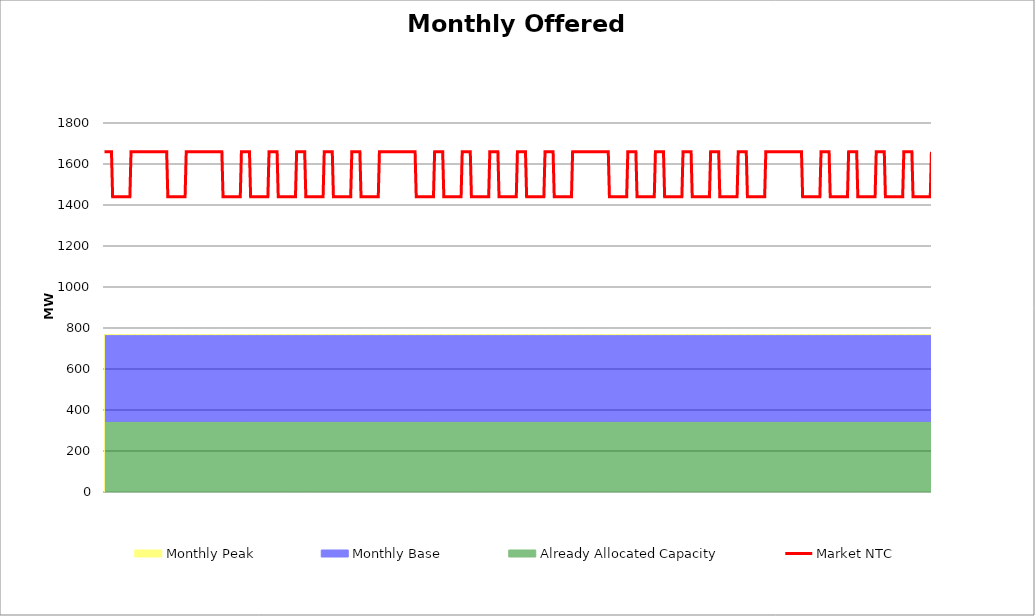
| Category | Market NTC |
|---|---|
| 0 | 1660 |
| 1 | 1660 |
| 2 | 1660 |
| 3 | 1660 |
| 4 | 1660 |
| 5 | 1660 |
| 6 | 1660 |
| 7 | 1440 |
| 8 | 1440 |
| 9 | 1440 |
| 10 | 1440 |
| 11 | 1440 |
| 12 | 1440 |
| 13 | 1440 |
| 14 | 1440 |
| 15 | 1440 |
| 16 | 1440 |
| 17 | 1440 |
| 18 | 1440 |
| 19 | 1440 |
| 20 | 1440 |
| 21 | 1440 |
| 22 | 1440 |
| 23 | 1660 |
| 24 | 1660 |
| 25 | 1660 |
| 26 | 1660 |
| 27 | 1660 |
| 28 | 1660 |
| 29 | 1660 |
| 30 | 1660 |
| 31 | 1660 |
| 32 | 1660 |
| 33 | 1660 |
| 34 | 1660 |
| 35 | 1660 |
| 36 | 1660 |
| 37 | 1660 |
| 38 | 1660 |
| 39 | 1660 |
| 40 | 1660 |
| 41 | 1660 |
| 42 | 1660 |
| 43 | 1660 |
| 44 | 1660 |
| 45 | 1660 |
| 46 | 1660 |
| 47 | 1660 |
| 48 | 1660 |
| 49 | 1660 |
| 50 | 1660 |
| 51 | 1660 |
| 52 | 1660 |
| 53 | 1660 |
| 54 | 1660 |
| 55 | 1440 |
| 56 | 1440 |
| 57 | 1440 |
| 58 | 1440 |
| 59 | 1440 |
| 60 | 1440 |
| 61 | 1440 |
| 62 | 1440 |
| 63 | 1440 |
| 64 | 1440 |
| 65 | 1440 |
| 66 | 1440 |
| 67 | 1440 |
| 68 | 1440 |
| 69 | 1440 |
| 70 | 1440 |
| 71 | 1660 |
| 72 | 1660 |
| 73 | 1660 |
| 74 | 1660 |
| 75 | 1660 |
| 76 | 1660 |
| 77 | 1660 |
| 78 | 1660 |
| 79 | 1660 |
| 80 | 1660 |
| 81 | 1660 |
| 82 | 1660 |
| 83 | 1660 |
| 84 | 1660 |
| 85 | 1660 |
| 86 | 1660 |
| 87 | 1660 |
| 88 | 1660 |
| 89 | 1660 |
| 90 | 1660 |
| 91 | 1660 |
| 92 | 1660 |
| 93 | 1660 |
| 94 | 1660 |
| 95 | 1660 |
| 96 | 1660 |
| 97 | 1660 |
| 98 | 1660 |
| 99 | 1660 |
| 100 | 1660 |
| 101 | 1660 |
| 102 | 1660 |
| 103 | 1440 |
| 104 | 1440 |
| 105 | 1440 |
| 106 | 1440 |
| 107 | 1440 |
| 108 | 1440 |
| 109 | 1440 |
| 110 | 1440 |
| 111 | 1440 |
| 112 | 1440 |
| 113 | 1440 |
| 114 | 1440 |
| 115 | 1440 |
| 116 | 1440 |
| 117 | 1440 |
| 118 | 1440 |
| 119 | 1660 |
| 120 | 1660 |
| 121 | 1660 |
| 122 | 1660 |
| 123 | 1660 |
| 124 | 1660 |
| 125 | 1660 |
| 126 | 1660 |
| 127 | 1440 |
| 128 | 1440 |
| 129 | 1440 |
| 130 | 1440 |
| 131 | 1440 |
| 132 | 1440 |
| 133 | 1440 |
| 134 | 1440 |
| 135 | 1440 |
| 136 | 1440 |
| 137 | 1440 |
| 138 | 1440 |
| 139 | 1440 |
| 140 | 1440 |
| 141 | 1440 |
| 142 | 1440 |
| 143 | 1660 |
| 144 | 1660 |
| 145 | 1660 |
| 146 | 1660 |
| 147 | 1660 |
| 148 | 1660 |
| 149 | 1660 |
| 150 | 1660 |
| 151 | 1440 |
| 152 | 1440 |
| 153 | 1440 |
| 154 | 1440 |
| 155 | 1440 |
| 156 | 1440 |
| 157 | 1440 |
| 158 | 1440 |
| 159 | 1440 |
| 160 | 1440 |
| 161 | 1440 |
| 162 | 1440 |
| 163 | 1440 |
| 164 | 1440 |
| 165 | 1440 |
| 166 | 1440 |
| 167 | 1660 |
| 168 | 1660 |
| 169 | 1660 |
| 170 | 1660 |
| 171 | 1660 |
| 172 | 1660 |
| 173 | 1660 |
| 174 | 1660 |
| 175 | 1440 |
| 176 | 1440 |
| 177 | 1440 |
| 178 | 1440 |
| 179 | 1440 |
| 180 | 1440 |
| 181 | 1440 |
| 182 | 1440 |
| 183 | 1440 |
| 184 | 1440 |
| 185 | 1440 |
| 186 | 1440 |
| 187 | 1440 |
| 188 | 1440 |
| 189 | 1440 |
| 190 | 1440 |
| 191 | 1660 |
| 192 | 1660 |
| 193 | 1660 |
| 194 | 1660 |
| 195 | 1660 |
| 196 | 1660 |
| 197 | 1660 |
| 198 | 1660 |
| 199 | 1440 |
| 200 | 1440 |
| 201 | 1440 |
| 202 | 1440 |
| 203 | 1440 |
| 204 | 1440 |
| 205 | 1440 |
| 206 | 1440 |
| 207 | 1440 |
| 208 | 1440 |
| 209 | 1440 |
| 210 | 1440 |
| 211 | 1440 |
| 212 | 1440 |
| 213 | 1440 |
| 214 | 1440 |
| 215 | 1660 |
| 216 | 1660 |
| 217 | 1660 |
| 218 | 1660 |
| 219 | 1660 |
| 220 | 1660 |
| 221 | 1660 |
| 222 | 1660 |
| 223 | 1440 |
| 224 | 1440 |
| 225 | 1440 |
| 226 | 1440 |
| 227 | 1440 |
| 228 | 1440 |
| 229 | 1440 |
| 230 | 1440 |
| 231 | 1440 |
| 232 | 1440 |
| 233 | 1440 |
| 234 | 1440 |
| 235 | 1440 |
| 236 | 1440 |
| 237 | 1440 |
| 238 | 1440 |
| 239 | 1660 |
| 240 | 1660 |
| 241 | 1660 |
| 242 | 1660 |
| 243 | 1660 |
| 244 | 1660 |
| 245 | 1660 |
| 246 | 1660 |
| 247 | 1660 |
| 248 | 1660 |
| 249 | 1660 |
| 250 | 1660 |
| 251 | 1660 |
| 252 | 1660 |
| 253 | 1660 |
| 254 | 1660 |
| 255 | 1660 |
| 256 | 1660 |
| 257 | 1660 |
| 258 | 1660 |
| 259 | 1660 |
| 260 | 1660 |
| 261 | 1660 |
| 262 | 1660 |
| 263 | 1660 |
| 264 | 1660 |
| 265 | 1660 |
| 266 | 1660 |
| 267 | 1660 |
| 268 | 1660 |
| 269 | 1660 |
| 270 | 1660 |
| 271 | 1440 |
| 272 | 1440 |
| 273 | 1440 |
| 274 | 1440 |
| 275 | 1440 |
| 276 | 1440 |
| 277 | 1440 |
| 278 | 1440 |
| 279 | 1440 |
| 280 | 1440 |
| 281 | 1440 |
| 282 | 1440 |
| 283 | 1440 |
| 284 | 1440 |
| 285 | 1440 |
| 286 | 1440 |
| 287 | 1660 |
| 288 | 1660 |
| 289 | 1660 |
| 290 | 1660 |
| 291 | 1660 |
| 292 | 1660 |
| 293 | 1660 |
| 294 | 1660 |
| 295 | 1440 |
| 296 | 1440 |
| 297 | 1440 |
| 298 | 1440 |
| 299 | 1440 |
| 300 | 1440 |
| 301 | 1440 |
| 302 | 1440 |
| 303 | 1440 |
| 304 | 1440 |
| 305 | 1440 |
| 306 | 1440 |
| 307 | 1440 |
| 308 | 1440 |
| 309 | 1440 |
| 310 | 1440 |
| 311 | 1660 |
| 312 | 1660 |
| 313 | 1660 |
| 314 | 1660 |
| 315 | 1660 |
| 316 | 1660 |
| 317 | 1660 |
| 318 | 1660 |
| 319 | 1440 |
| 320 | 1440 |
| 321 | 1440 |
| 322 | 1440 |
| 323 | 1440 |
| 324 | 1440 |
| 325 | 1440 |
| 326 | 1440 |
| 327 | 1440 |
| 328 | 1440 |
| 329 | 1440 |
| 330 | 1440 |
| 331 | 1440 |
| 332 | 1440 |
| 333 | 1440 |
| 334 | 1440 |
| 335 | 1660 |
| 336 | 1660 |
| 337 | 1660 |
| 338 | 1660 |
| 339 | 1660 |
| 340 | 1660 |
| 341 | 1660 |
| 342 | 1660 |
| 343 | 1440 |
| 344 | 1440 |
| 345 | 1440 |
| 346 | 1440 |
| 347 | 1440 |
| 348 | 1440 |
| 349 | 1440 |
| 350 | 1440 |
| 351 | 1440 |
| 352 | 1440 |
| 353 | 1440 |
| 354 | 1440 |
| 355 | 1440 |
| 356 | 1440 |
| 357 | 1440 |
| 358 | 1440 |
| 359 | 1660 |
| 360 | 1660 |
| 361 | 1660 |
| 362 | 1660 |
| 363 | 1660 |
| 364 | 1660 |
| 365 | 1660 |
| 366 | 1660 |
| 367 | 1440 |
| 368 | 1440 |
| 369 | 1440 |
| 370 | 1440 |
| 371 | 1440 |
| 372 | 1440 |
| 373 | 1440 |
| 374 | 1440 |
| 375 | 1440 |
| 376 | 1440 |
| 377 | 1440 |
| 378 | 1440 |
| 379 | 1440 |
| 380 | 1440 |
| 381 | 1440 |
| 382 | 1440 |
| 383 | 1660 |
| 384 | 1660 |
| 385 | 1660 |
| 386 | 1660 |
| 387 | 1660 |
| 388 | 1660 |
| 389 | 1660 |
| 390 | 1660 |
| 391 | 1440 |
| 392 | 1440 |
| 393 | 1440 |
| 394 | 1440 |
| 395 | 1440 |
| 396 | 1440 |
| 397 | 1440 |
| 398 | 1440 |
| 399 | 1440 |
| 400 | 1440 |
| 401 | 1440 |
| 402 | 1440 |
| 403 | 1440 |
| 404 | 1440 |
| 405 | 1440 |
| 406 | 1440 |
| 407 | 1660 |
| 408 | 1660 |
| 409 | 1660 |
| 410 | 1660 |
| 411 | 1660 |
| 412 | 1660 |
| 413 | 1660 |
| 414 | 1660 |
| 415 | 1660 |
| 416 | 1660 |
| 417 | 1660 |
| 418 | 1660 |
| 419 | 1660 |
| 420 | 1660 |
| 421 | 1660 |
| 422 | 1660 |
| 423 | 1660 |
| 424 | 1660 |
| 425 | 1660 |
| 426 | 1660 |
| 427 | 1660 |
| 428 | 1660 |
| 429 | 1660 |
| 430 | 1660 |
| 431 | 1660 |
| 432 | 1660 |
| 433 | 1660 |
| 434 | 1660 |
| 435 | 1660 |
| 436 | 1660 |
| 437 | 1660 |
| 438 | 1660 |
| 439 | 1440 |
| 440 | 1440 |
| 441 | 1440 |
| 442 | 1440 |
| 443 | 1440 |
| 444 | 1440 |
| 445 | 1440 |
| 446 | 1440 |
| 447 | 1440 |
| 448 | 1440 |
| 449 | 1440 |
| 450 | 1440 |
| 451 | 1440 |
| 452 | 1440 |
| 453 | 1440 |
| 454 | 1440 |
| 455 | 1660 |
| 456 | 1660 |
| 457 | 1660 |
| 458 | 1660 |
| 459 | 1660 |
| 460 | 1660 |
| 461 | 1660 |
| 462 | 1660 |
| 463 | 1440 |
| 464 | 1440 |
| 465 | 1440 |
| 466 | 1440 |
| 467 | 1440 |
| 468 | 1440 |
| 469 | 1440 |
| 470 | 1440 |
| 471 | 1440 |
| 472 | 1440 |
| 473 | 1440 |
| 474 | 1440 |
| 475 | 1440 |
| 476 | 1440 |
| 477 | 1440 |
| 478 | 1440 |
| 479 | 1660 |
| 480 | 1660 |
| 481 | 1660 |
| 482 | 1660 |
| 483 | 1660 |
| 484 | 1660 |
| 485 | 1660 |
| 486 | 1660 |
| 487 | 1440 |
| 488 | 1440 |
| 489 | 1440 |
| 490 | 1440 |
| 491 | 1440 |
| 492 | 1440 |
| 493 | 1440 |
| 494 | 1440 |
| 495 | 1440 |
| 496 | 1440 |
| 497 | 1440 |
| 498 | 1440 |
| 499 | 1440 |
| 500 | 1440 |
| 501 | 1440 |
| 502 | 1440 |
| 503 | 1660 |
| 504 | 1660 |
| 505 | 1660 |
| 506 | 1660 |
| 507 | 1660 |
| 508 | 1660 |
| 509 | 1660 |
| 510 | 1660 |
| 511 | 1440 |
| 512 | 1440 |
| 513 | 1440 |
| 514 | 1440 |
| 515 | 1440 |
| 516 | 1440 |
| 517 | 1440 |
| 518 | 1440 |
| 519 | 1440 |
| 520 | 1440 |
| 521 | 1440 |
| 522 | 1440 |
| 523 | 1440 |
| 524 | 1440 |
| 525 | 1440 |
| 526 | 1440 |
| 527 | 1660 |
| 528 | 1660 |
| 529 | 1660 |
| 530 | 1660 |
| 531 | 1660 |
| 532 | 1660 |
| 533 | 1660 |
| 534 | 1660 |
| 535 | 1440 |
| 536 | 1440 |
| 537 | 1440 |
| 538 | 1440 |
| 539 | 1440 |
| 540 | 1440 |
| 541 | 1440 |
| 542 | 1440 |
| 543 | 1440 |
| 544 | 1440 |
| 545 | 1440 |
| 546 | 1440 |
| 547 | 1440 |
| 548 | 1440 |
| 549 | 1440 |
| 550 | 1440 |
| 551 | 1660 |
| 552 | 1660 |
| 553 | 1660 |
| 554 | 1660 |
| 555 | 1660 |
| 556 | 1660 |
| 557 | 1660 |
| 558 | 1660 |
| 559 | 1440 |
| 560 | 1440 |
| 561 | 1440 |
| 562 | 1440 |
| 563 | 1440 |
| 564 | 1440 |
| 565 | 1440 |
| 566 | 1440 |
| 567 | 1440 |
| 568 | 1440 |
| 569 | 1440 |
| 570 | 1440 |
| 571 | 1440 |
| 572 | 1440 |
| 573 | 1440 |
| 574 | 1440 |
| 575 | 1660 |
| 576 | 1660 |
| 577 | 1660 |
| 578 | 1660 |
| 579 | 1660 |
| 580 | 1660 |
| 581 | 1660 |
| 582 | 1660 |
| 583 | 1660 |
| 584 | 1660 |
| 585 | 1660 |
| 586 | 1660 |
| 587 | 1660 |
| 588 | 1660 |
| 589 | 1660 |
| 590 | 1660 |
| 591 | 1660 |
| 592 | 1660 |
| 593 | 1660 |
| 594 | 1660 |
| 595 | 1660 |
| 596 | 1660 |
| 597 | 1660 |
| 598 | 1660 |
| 599 | 1660 |
| 600 | 1660 |
| 601 | 1660 |
| 602 | 1660 |
| 603 | 1660 |
| 604 | 1660 |
| 605 | 1660 |
| 606 | 1660 |
| 607 | 1440 |
| 608 | 1440 |
| 609 | 1440 |
| 610 | 1440 |
| 611 | 1440 |
| 612 | 1440 |
| 613 | 1440 |
| 614 | 1440 |
| 615 | 1440 |
| 616 | 1440 |
| 617 | 1440 |
| 618 | 1440 |
| 619 | 1440 |
| 620 | 1440 |
| 621 | 1440 |
| 622 | 1440 |
| 623 | 1660 |
| 624 | 1660 |
| 625 | 1660 |
| 626 | 1660 |
| 627 | 1660 |
| 628 | 1660 |
| 629 | 1660 |
| 630 | 1660 |
| 631 | 1440 |
| 632 | 1440 |
| 633 | 1440 |
| 634 | 1440 |
| 635 | 1440 |
| 636 | 1440 |
| 637 | 1440 |
| 638 | 1440 |
| 639 | 1440 |
| 640 | 1440 |
| 641 | 1440 |
| 642 | 1440 |
| 643 | 1440 |
| 644 | 1440 |
| 645 | 1440 |
| 646 | 1440 |
| 647 | 1660 |
| 648 | 1660 |
| 649 | 1660 |
| 650 | 1660 |
| 651 | 1660 |
| 652 | 1660 |
| 653 | 1660 |
| 654 | 1660 |
| 655 | 1440 |
| 656 | 1440 |
| 657 | 1440 |
| 658 | 1440 |
| 659 | 1440 |
| 660 | 1440 |
| 661 | 1440 |
| 662 | 1440 |
| 663 | 1440 |
| 664 | 1440 |
| 665 | 1440 |
| 666 | 1440 |
| 667 | 1440 |
| 668 | 1440 |
| 669 | 1440 |
| 670 | 1440 |
| 671 | 1660 |
| 672 | 1660 |
| 673 | 1660 |
| 674 | 1660 |
| 675 | 1660 |
| 676 | 1660 |
| 677 | 1660 |
| 678 | 1660 |
| 679 | 1440 |
| 680 | 1440 |
| 681 | 1440 |
| 682 | 1440 |
| 683 | 1440 |
| 684 | 1440 |
| 685 | 1440 |
| 686 | 1440 |
| 687 | 1440 |
| 688 | 1440 |
| 689 | 1440 |
| 690 | 1440 |
| 691 | 1440 |
| 692 | 1440 |
| 693 | 1440 |
| 694 | 1440 |
| 695 | 1660 |
| 696 | 1660 |
| 697 | 1660 |
| 698 | 1660 |
| 699 | 1660 |
| 700 | 1660 |
| 701 | 1660 |
| 702 | 1660 |
| 703 | 1440 |
| 704 | 1440 |
| 705 | 1440 |
| 706 | 1440 |
| 707 | 1440 |
| 708 | 1440 |
| 709 | 1440 |
| 710 | 1440 |
| 711 | 1440 |
| 712 | 1440 |
| 713 | 1440 |
| 714 | 1440 |
| 715 | 1440 |
| 716 | 1440 |
| 717 | 1440 |
| 718 | 1440 |
| 719 | 1660 |